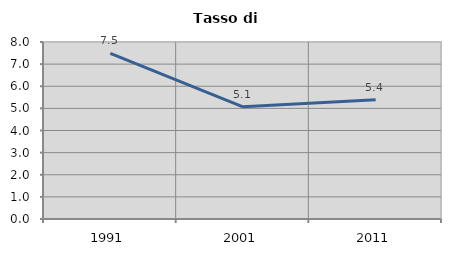
| Category | Tasso di disoccupazione   |
|---|---|
| 1991.0 | 7.486 |
| 2001.0 | 5.07 |
| 2011.0 | 5.386 |